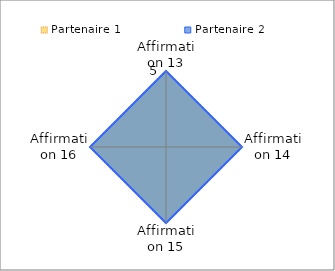
| Category | Partenaire 1 | Partenaire 2 |
|---|---|---|
| Affirmation 13 | 5 | 5 |
| Affirmation 14 | 5 | 5 |
| Affirmation 15 | 5 | 5 |
| Affirmation 16 | 5 | 5 |